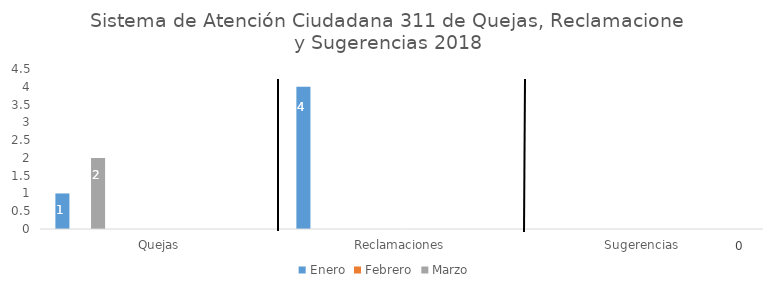
| Category | Enero | Febrero | Marzo | Abril | Mayo | Junio | Julio | Agosto | Septiembre | Octubre | Noviembre | Diciembre |
|---|---|---|---|---|---|---|---|---|---|---|---|---|
| Quejas | 1 | 0 | 2 | 0 | 0 | 0 | 0 | 0 | 0 | 0 | 0 | 0 |
| Reclamaciones | 4 | 0 | 0 | 0 | 0 | 0 | 0 | 0 | 0 | 0 | 0 | 0 |
| Sugerencias | 0 | 0 | 0 | 0 | 0 | 0 | 0 | 0 | 0 | 0 | 0 | 0 |